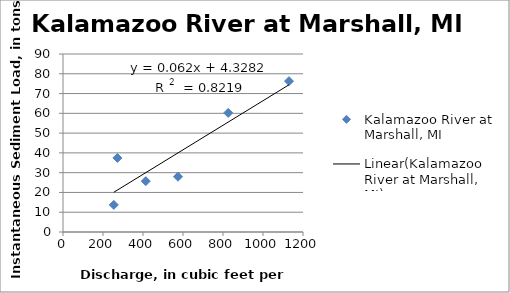
| Category | Kalamazoo River at Marshall, MI |
|---|---|
| 254.0 | 13.716 |
| 414.0 | 25.709 |
| 575.0 | 27.945 |
| 272.0 | 37.454 |
| 1130.0 | 76.275 |
| 826.0 | 60.215 |